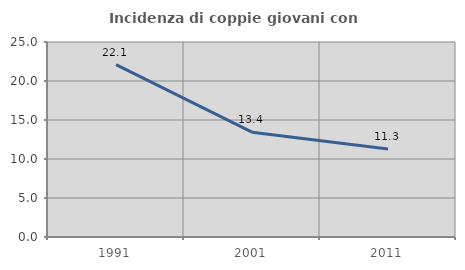
| Category | Incidenza di coppie giovani con figli |
|---|---|
| 1991.0 | 22.094 |
| 2001.0 | 13.443 |
| 2011.0 | 11.274 |